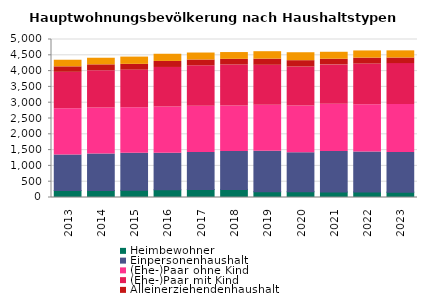
| Category | Heimbewohner | Einpersonenhaushalt | (Ehe-)Paar ohne Kind | (Ehe-)Paar mit Kind | Alleinerziehendenhaushalt | sonstiger Mehrpersonenhaushalt |
|---|---|---|---|---|---|---|
| 2013.0 | 218 | 1124 | 1466 | 1154 | 173 | 209 |
| 2014.0 | 218 | 1157 | 1457 | 1181 | 185 | 209 |
| 2015.0 | 227 | 1175 | 1439 | 1190 | 182 | 230 |
| 2016.0 | 242 | 1160 | 1460 | 1253 | 191 | 227 |
| 2017.0 | 254 | 1172 | 1463 | 1280 | 182 | 221 |
| 2018.0 | 257 | 1202 | 1436 | 1298 | 179 | 215 |
| 2019.0 | 182 | 1280 | 1454 | 1268 | 194 | 236 |
| 2020.0 | 182 | 1238 | 1472 | 1238 | 200 | 251 |
| 2021.0 | 173 | 1280 | 1499 | 1244 | 179 | 221 |
| 2022.0 | 176 | 1262 | 1496 | 1289 | 188 | 227 |
| 2023.0 | 170 | 1256 | 1520 | 1292 | 176 | 227 |